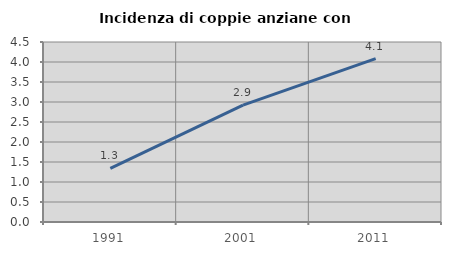
| Category | Incidenza di coppie anziane con figli |
|---|---|
| 1991.0 | 1.341 |
| 2001.0 | 2.924 |
| 2011.0 | 4.086 |